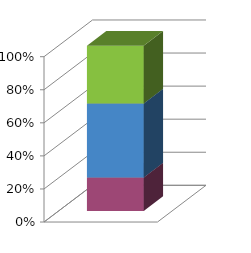
| Category | Series 2 | Series 1 | Series 0 |
|---|---|---|---|
| 0 | 20267 | 44733 | 35000 |